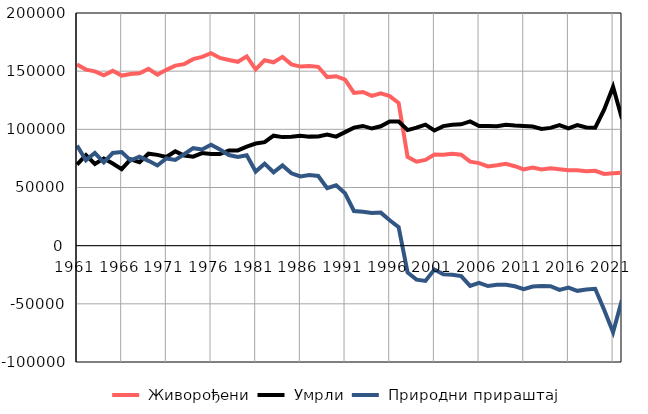
| Category |  Живорођени |  Умрли |  Природни прираштај |
|---|---|---|---|
| 1961.0 | 155783 | 69749 | 86034 |
| 1962.0 | 151344 | 77854 | 73490 |
| 1963.0 | 149849 | 70201 | 79648 |
| 1964.0 | 146404 | 74831 | 71573 |
| 1965.0 | 150268 | 70623 | 79645 |
| 1966.0 | 146204 | 65737 | 80467 |
| 1967.0 | 147492 | 74223 | 73269 |
| 1968.0 | 148248 | 71713 | 76535 |
| 1969.0 | 151958 | 79044 | 72914 |
| 1970.0 | 146949 | 78040 | 68909 |
| 1971.0 | 151130 | 76184 | 74946 |
| 1972.0 | 154802 | 81092 | 73710 |
| 1973.0 | 156075 | 77510 | 78565 |
| 1974.0 | 160305 | 76532 | 83773 |
| 1975.0 | 162255 | 79608 | 82647 |
| 1976.0 | 165390 | 78714 | 86676 |
| 1977.0 | 161359 | 78735 | 82624 |
| 1978.0 | 159649 | 81762 | 77887 |
| 1979.0 | 158078 | 81881 | 76197 |
| 1980.0 | 162744 | 85089 | 77655 |
| 1981.0 | 151518 | 87763 | 63755 |
| 1982.0 | 159440 | 88952 | 70488 |
| 1983.0 | 157648 | 94546 | 63102 |
| 1984.0 | 162279 | 93315 | 68964 |
| 1985.0 | 155863 | 93662 | 62201 |
| 1986.0 | 153938 | 94423 | 59515 |
| 1987.0 | 154500 | 93733 | 60767 |
| 1988.0 | 153754 | 93873 | 59881 |
| 1989.0 | 144926 | 95437 | 49489 |
| 1990.0 | 145642 | 93729 | 51913 |
| 1991.0 | 142641 | 97598 | 45043 |
| 1992.0 | 131295 | 101479 | 29816 |
| 1993.0 | 132063 | 102925 | 29138 |
| 1994.0 | 128742 | 100678 | 28064 |
| 1995.0 | 131012 | 102604 | 28408 |
| 1996.0 | 128589 | 106762 | 21827 |
| 1997.0 | 122636 | 106692 | 15944 |
| 1998.0 | 76330 | 99376 | -23046 |
| 1999.0 | 72222 | 101444 | -29222 |
| 2000.0 | 73764 | 104042 | -30278 |
| 2001.0 | 78435 | 99008 | -20573 |
| 2002.0 | 78101 | 102785 | -24684 |
| 2003.0 | 79025 | 103946 | -24921 |
| 2004.0 | 78186 | 104320 | -26134 |
| 2005.0 | 72180 | 106771 | -34591 |
| 2006.0 | 70997 | 102884 | -31887 |
| 2007.0 | 68102 | 102805 | -34703 |
| 2008.0 | 69083 | 102711 | -33628 |
| 2009.0 | 70299 | 104000 | -33701 |
| 2010.0 | 68304 | 103211 | -34907 |
| 2011.0 | 65598 | 102935 | -37337 |
| 2012.0 | 67257 | 102400 | -35143 |
| 2013.0 | 65554 | 100300 | -34746 |
| 2014.0 | 66461 | 101247 | -34786 |
| 2015.0 | 65657 | 103678 | -38021 |
| 2016.0 | 64734 | 100834 | -36100 |
| 2017.0 | 64894 | 103722 | -38828 |
| 2018.0 | 63975 | 101655 | -37680 |
| 2019.0 | 64399 | 101458 | -37059 |
| 2020.0 | 61692 | 116850 | -55158 |
| 2021.0 | 62180 | 136622 | -74442 |
| 2022.0 | 62700 | 109203 | -46503 |